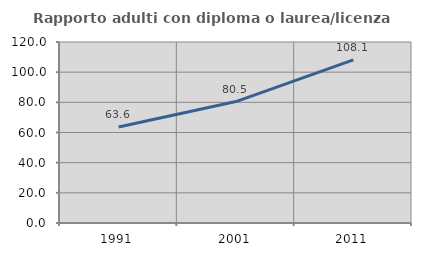
| Category | Rapporto adulti con diploma o laurea/licenza media  |
|---|---|
| 1991.0 | 63.641 |
| 2001.0 | 80.518 |
| 2011.0 | 108.123 |